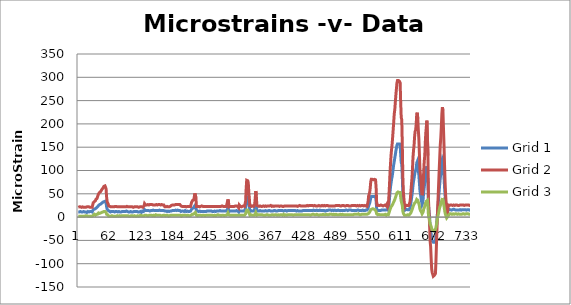
| Category | Grid 1 | Grid 2 | Grid 3 |
|---|---|---|---|
| 0 | 11 | 21 | 2 |
| 1 | 11 | 21 | 2 |
| 2 | 11 | 22 | 2 |
| 3 | 11 | 21 | 2 |
| 4 | 12 | 22 | 2 |
| 5 | 11 | 22 | 2 |
| 6 | 11 | 21 | 2 |
| 7 | 11 | 21 | 3 |
| 8 | 11 | 22 | 2 |
| 9 | 11 | 22 | 2 |
| 10 | 12 | 21 | 2 |
| 11 | 11 | 22 | 2 |
| 12 | 11 | 21 | 2 |
| 13 | 11 | 21 | 2 |
| 14 | 11 | 21 | 3 |
| 15 | 11 | 22 | 3 |
| 16 | 10 | 22 | 3 |
| 17 | 12 | 21 | 3 |
| 18 | 12 | 22 | 2 |
| 19 | 12 | 21 | 2 |
| 20 | 11 | 22 | 2 |
| 21 | 11 | 22 | 2 |
| 22 | 12 | 21 | 2 |
| 23 | 11 | 22 | 3 |
| 24 | 12 | 21 | 2 |
| 25 | 11 | 22 | 2 |
| 26 | 11 | 21 | 2 |
| 27 | 12 | 23 | 2 |
| 28 | 16 | 31 | 4 |
| 29 | 17 | 33 | 5 |
| 30 | 17 | 33 | 6 |
| 31 | 18 | 35 | 5 |
| 32 | 18 | 35 | 4 |
| 33 | 19 | 38 | 6 |
| 34 | 20 | 40 | 6 |
| 35 | 21 | 40 | 6 |
| 36 | 22 | 41 | 6 |
| 37 | 23 | 47 | 8 |
| 38 | 25 | 50 | 9 |
| 39 | 26 | 51 | 8 |
| 40 | 27 | 53 | 8 |
| 41 | 27 | 54 | 9 |
| 42 | 28 | 55 | 9 |
| 43 | 29 | 57 | 10 |
| 44 | 30 | 59 | 10 |
| 45 | 31 | 61 | 11 |
| 46 | 32 | 62 | 11 |
| 47 | 33 | 64 | 12 |
| 48 | 33 | 66 | 12 |
| 49 | 34 | 67 | 12 |
| 50 | 34 | 67 | 12 |
| 51 | 33 | 68 | 12 |
| 52 | 30 | 61 | 10 |
| 53 | 22 | 43 | 6 |
| 54 | 17 | 33 | 4 |
| 55 | 16 | 31 | 5 |
| 56 | 14 | 28 | 5 |
| 57 | 12 | 24 | 2 |
| 58 | 13 | 22 | 2 |
| 59 | 12 | 23 | 2 |
| 60 | 11 | 21 | 3 |
| 61 | 12 | 22 | 2 |
| 62 | 12 | 22 | 4 |
| 63 | 12 | 22 | 3 |
| 64 | 12 | 22 | 2 |
| 65 | 11 | 22 | 2 |
| 66 | 12 | 22 | 2 |
| 67 | 12 | 22 | 2 |
| 68 | 11 | 22 | 3 |
| 69 | 12 | 23 | 2 |
| 70 | 12 | 22 | 2 |
| 71 | 11 | 23 | 2 |
| 72 | 12 | 22 | 3 |
| 73 | 11 | 22 | 3 |
| 74 | 11 | 22 | 3 |
| 75 | 11 | 22 | 2 |
| 76 | 12 | 22 | 3 |
| 77 | 11 | 22 | 3 |
| 78 | 11 | 22 | 2 |
| 79 | 12 | 22 | 2 |
| 80 | 11 | 22 | 3 |
| 81 | 12 | 22 | 3 |
| 82 | 12 | 22 | 3 |
| 83 | 12 | 22 | 3 |
| 84 | 12 | 22 | 2 |
| 85 | 12 | 22 | 3 |
| 86 | 12 | 22 | 3 |
| 87 | 11 | 22 | 3 |
| 88 | 12 | 23 | 2 |
| 89 | 12 | 22 | 3 |
| 90 | 13 | 21 | 2 |
| 91 | 12 | 23 | 3 |
| 92 | 12 | 22 | 4 |
| 93 | 12 | 22 | 3 |
| 94 | 11 | 22 | 3 |
| 95 | 12 | 22 | 2 |
| 96 | 11 | 22 | 2 |
| 97 | 12 | 22 | 2 |
| 98 | 12 | 21 | 3 |
| 99 | 13 | 22 | 3 |
| 100 | 11 | 22 | 3 |
| 101 | 12 | 22 | 3 |
| 102 | 11 | 22 | 3 |
| 103 | 12 | 21 | 2 |
| 104 | 12 | 23 | 3 |
| 105 | 11 | 22 | 3 |
| 106 | 12 | 23 | 2 |
| 107 | 12 | 22 | 2 |
| 108 | 12 | 21 | 3 |
| 109 | 12 | 22 | 2 |
| 110 | 12 | 22 | 3 |
| 111 | 11 | 22 | 3 |
| 112 | 11 | 23 | 3 |
| 113 | 12 | 21 | 2 |
| 114 | 11 | 22 | 4 |
| 115 | 12 | 22 | 3 |
| 116 | 12 | 22 | 3 |
| 117 | 11 | 22 | 4 |
| 118 | 10 | 22 | 3 |
| 119 | 12 | 22 | 3 |
| 120 | 13 | 22 | 3 |
| 121 | 11 | 21 | 3 |
| 122 | 12 | 22 | 2 |
| 123 | 12 | 24 | 3 |
| 124 | 16 | 29 | 5 |
| 125 | 14 | 27 | 4 |
| 126 | 14 | 26 | 3 |
| 127 | 14 | 26 | 4 |
| 128 | 14 | 26 | 4 |
| 129 | 13 | 26 | 3 |
| 130 | 14 | 27 | 4 |
| 131 | 14 | 26 | 3 |
| 132 | 14 | 26 | 4 |
| 133 | 14 | 26 | 4 |
| 134 | 13 | 27 | 4 |
| 135 | 14 | 26 | 4 |
| 136 | 14 | 27 | 3 |
| 137 | 15 | 26 | 4 |
| 138 | 14 | 27 | 4 |
| 139 | 14 | 27 | 3 |
| 140 | 15 | 26 | 4 |
| 141 | 14 | 26 | 4 |
| 142 | 14 | 26 | 4 |
| 143 | 14 | 26 | 3 |
| 144 | 14 | 26 | 4 |
| 145 | 14 | 26 | 5 |
| 146 | 14 | 27 | 4 |
| 147 | 14 | 27 | 4 |
| 148 | 14 | 26 | 4 |
| 149 | 14 | 26 | 4 |
| 150 | 14 | 27 | 4 |
| 151 | 14 | 27 | 4 |
| 152 | 15 | 27 | 4 |
| 153 | 14 | 27 | 4 |
| 154 | 14 | 26 | 4 |
| 155 | 14 | 27 | 3 |
| 156 | 14 | 27 | 4 |
| 157 | 14 | 26 | 3 |
| 158 | 14 | 26 | 3 |
| 159 | 13 | 26 | 4 |
| 160 | 14 | 26 | 4 |
| 161 | 13 | 24 | 4 |
| 162 | 13 | 22 | 3 |
| 163 | 12 | 22 | 3 |
| 164 | 13 | 22 | 3 |
| 165 | 11 | 22 | 4 |
| 166 | 12 | 23 | 3 |
| 167 | 13 | 23 | 4 |
| 168 | 13 | 22 | 3 |
| 169 | 12 | 23 | 2 |
| 170 | 12 | 22 | 4 |
| 171 | 13 | 23 | 3 |
| 172 | 13 | 23 | 4 |
| 173 | 12 | 23 | 4 |
| 174 | 13 | 25 | 4 |
| 175 | 15 | 27 | 4 |
| 176 | 14 | 26 | 4 |
| 177 | 15 | 26 | 4 |
| 178 | 14 | 26 | 4 |
| 179 | 15 | 27 | 4 |
| 180 | 14 | 26 | 5 |
| 181 | 15 | 26 | 4 |
| 182 | 15 | 27 | 4 |
| 183 | 14 | 27 | 4 |
| 184 | 14 | 27 | 3 |
| 185 | 15 | 27 | 4 |
| 186 | 15 | 27 | 4 |
| 187 | 14 | 27 | 4 |
| 188 | 14 | 27 | 4 |
| 189 | 15 | 26 | 4 |
| 190 | 14 | 27 | 4 |
| 191 | 13 | 25 | 4 |
| 192 | 12 | 24 | 4 |
| 193 | 13 | 23 | 2 |
| 194 | 13 | 23 | 3 |
| 195 | 12 | 23 | 4 |
| 196 | 13 | 23 | 4 |
| 197 | 12 | 23 | 4 |
| 198 | 12 | 23 | 4 |
| 199 | 11 | 23 | 4 |
| 200 | 14 | 23 | 3 |
| 201 | 12 | 23 | 4 |
| 202 | 12 | 22 | 3 |
| 203 | 13 | 23 | 3 |
| 204 | 13 | 23 | 4 |
| 205 | 13 | 23 | 4 |
| 206 | 12 | 23 | 4 |
| 207 | 13 | 23 | 3 |
| 208 | 12 | 23 | 4 |
| 209 | 12 | 23 | 3 |
| 210 | 13 | 23 | 3 |
| 211 | 13 | 25 | 4 |
| 212 | 17 | 32 | 5 |
| 213 | 17 | 32 | 6 |
| 214 | 19 | 36 | 6 |
| 215 | 20 | 37 | 6 |
| 216 | 20 | 37 | 7 |
| 217 | 23 | 43 | 8 |
| 218 | 25 | 51 | 10 |
| 219 | 26 | 51 | 10 |
| 220 | 22 | 42 | 7 |
| 221 | 13 | 23 | 4 |
| 222 | 13 | 22 | 4 |
| 223 | 13 | 23 | 3 |
| 224 | 12 | 23 | 4 |
| 225 | 12 | 23 | 4 |
| 226 | 13 | 24 | 3 |
| 227 | 13 | 22 | 4 |
| 228 | 13 | 22 | 4 |
| 229 | 12 | 23 | 4 |
| 230 | 13 | 23 | 4 |
| 231 | 12 | 24 | 3 |
| 232 | 13 | 22 | 4 |
| 233 | 12 | 23 | 4 |
| 234 | 12 | 23 | 4 |
| 235 | 12 | 23 | 4 |
| 236 | 13 | 23 | 3 |
| 237 | 12 | 23 | 3 |
| 238 | 12 | 22 | 4 |
| 239 | 12 | 23 | 4 |
| 240 | 13 | 23 | 4 |
| 241 | 13 | 23 | 4 |
| 242 | 13 | 24 | 4 |
| 243 | 13 | 23 | 4 |
| 244 | 13 | 23 | 4 |
| 245 | 13 | 23 | 4 |
| 246 | 12 | 22 | 5 |
| 247 | 13 | 23 | 4 |
| 248 | 12 | 23 | 4 |
| 249 | 13 | 23 | 4 |
| 250 | 12 | 23 | 3 |
| 251 | 12 | 23 | 4 |
| 252 | 13 | 23 | 4 |
| 253 | 12 | 23 | 3 |
| 254 | 13 | 23 | 3 |
| 255 | 13 | 23 | 4 |
| 256 | 13 | 23 | 4 |
| 257 | 12 | 23 | 3 |
| 258 | 13 | 23 | 4 |
| 259 | 13 | 23 | 4 |
| 260 | 13 | 23 | 3 |
| 261 | 13 | 23 | 5 |
| 262 | 13 | 23 | 4 |
| 263 | 13 | 23 | 4 |
| 264 | 13 | 23 | 5 |
| 265 | 14 | 23 | 4 |
| 266 | 13 | 22 | 5 |
| 267 | 13 | 23 | 3 |
| 268 | 13 | 23 | 4 |
| 269 | 13 | 24 | 4 |
| 270 | 14 | 22 | 4 |
| 271 | 13 | 23 | 4 |
| 272 | 13 | 23 | 4 |
| 273 | 13 | 23 | 3 |
| 274 | 13 | 23 | 3 |
| 275 | 13 | 23 | 4 |
| 276 | 13 | 24 | 4 |
| 277 | 13 | 23 | 4 |
| 278 | 13 | 24 | 3 |
| 279 | 17 | 33 | 6 |
| 280 | 20 | 38 | 9 |
| 281 | 17 | 32 | 6 |
| 282 | 12 | 22 | 4 |
| 283 | 13 | 24 | 4 |
| 284 | 13 | 23 | 4 |
| 285 | 13 | 23 | 4 |
| 286 | 13 | 23 | 4 |
| 287 | 13 | 23 | 4 |
| 288 | 13 | 23 | 5 |
| 289 | 13 | 23 | 4 |
| 290 | 13 | 23 | 5 |
| 291 | 12 | 23 | 4 |
| 292 | 13 | 23 | 5 |
| 293 | 13 | 23 | 4 |
| 294 | 13 | 24 | 4 |
| 295 | 13 | 24 | 4 |
| 296 | 14 | 24 | 4 |
| 297 | 14 | 24 | 4 |
| 298 | 13 | 23 | 4 |
| 299 | 12 | 23 | 4 |
| 300 | 11 | 20 | 4 |
| 301 | 14 | 26 | 4 |
| 302 | 16 | 28 | 5 |
| 303 | 13 | 23 | 4 |
| 304 | 13 | 23 | 4 |
| 305 | 13 | 22 | 4 |
| 306 | 12 | 22 | 4 |
| 307 | 13 | 23 | 4 |
| 308 | 13 | 23 | 4 |
| 309 | 13 | 24 | 4 |
| 310 | 13 | 23 | 5 |
| 311 | 13 | 23 | 4 |
| 312 | 13 | 25 | 4 |
| 313 | 20 | 34 | 7 |
| 314 | 32 | 61 | 12 |
| 315 | 39 | 79 | 15 |
| 316 | 41 | 79 | 16 |
| 317 | 42 | 78 | 15 |
| 318 | 39 | 73 | 14 |
| 319 | 28 | 52 | 10 |
| 320 | 22 | 39 | 7 |
| 321 | 12 | 22 | 4 |
| 322 | 13 | 25 | 5 |
| 323 | 14 | 26 | 5 |
| 324 | 13 | 23 | 4 |
| 325 | 13 | 23 | 4 |
| 326 | 13 | 24 | 5 |
| 327 | 13 | 24 | 4 |
| 328 | 13 | 23 | 4 |
| 329 | 14 | 24 | 4 |
| 330 | 16 | 28 | 5 |
| 331 | 22 | 41 | 7 |
| 332 | 30 | 56 | 10 |
| 333 | 24 | 46 | 8 |
| 334 | 14 | 25 | 4 |
| 335 | 13 | 23 | 4 |
| 336 | 13 | 24 | 5 |
| 337 | 13 | 24 | 5 |
| 338 | 13 | 23 | 5 |
| 339 | 13 | 24 | 5 |
| 340 | 14 | 24 | 5 |
| 341 | 13 | 23 | 5 |
| 342 | 13 | 23 | 5 |
| 343 | 13 | 23 | 5 |
| 344 | 13 | 23 | 5 |
| 345 | 13 | 24 | 5 |
| 346 | 13 | 24 | 4 |
| 347 | 13 | 23 | 4 |
| 348 | 13 | 23 | 4 |
| 349 | 14 | 23 | 4 |
| 350 | 14 | 24 | 4 |
| 351 | 13 | 24 | 4 |
| 352 | 13 | 23 | 5 |
| 353 | 13 | 24 | 4 |
| 354 | 13 | 24 | 5 |
| 355 | 13 | 24 | 5 |
| 356 | 14 | 24 | 4 |
| 357 | 13 | 23 | 5 |
| 358 | 14 | 24 | 4 |
| 359 | 14 | 24 | 4 |
| 360 | 13 | 25 | 4 |
| 361 | 13 | 24 | 5 |
| 362 | 13 | 23 | 5 |
| 363 | 14 | 23 | 4 |
| 364 | 13 | 24 | 5 |
| 365 | 14 | 23 | 5 |
| 366 | 14 | 23 | 4 |
| 367 | 13 | 25 | 5 |
| 368 | 14 | 24 | 5 |
| 369 | 13 | 24 | 4 |
| 370 | 13 | 24 | 5 |
| 371 | 14 | 24 | 5 |
| 372 | 13 | 24 | 4 |
| 373 | 13 | 24 | 5 |
| 374 | 14 | 24 | 5 |
| 375 | 14 | 23 | 5 |
| 376 | 14 | 23 | 4 |
| 377 | 13 | 24 | 5 |
| 378 | 14 | 24 | 5 |
| 379 | 13 | 24 | 4 |
| 380 | 14 | 24 | 5 |
| 381 | 13 | 25 | 4 |
| 382 | 14 | 23 | 4 |
| 383 | 13 | 24 | 4 |
| 384 | 13 | 23 | 6 |
| 385 | 13 | 24 | 5 |
| 386 | 14 | 24 | 4 |
| 387 | 13 | 23 | 5 |
| 388 | 14 | 24 | 5 |
| 389 | 13 | 24 | 5 |
| 390 | 13 | 24 | 4 |
| 391 | 13 | 25 | 5 |
| 392 | 14 | 24 | 5 |
| 393 | 13 | 24 | 5 |
| 394 | 14 | 24 | 5 |
| 395 | 13 | 24 | 5 |
| 396 | 14 | 24 | 5 |
| 397 | 13 | 25 | 5 |
| 398 | 14 | 24 | 5 |
| 399 | 13 | 24 | 5 |
| 400 | 14 | 24 | 5 |
| 401 | 14 | 24 | 5 |
| 402 | 14 | 24 | 4 |
| 403 | 13 | 24 | 5 |
| 404 | 14 | 24 | 5 |
| 405 | 14 | 25 | 4 |
| 406 | 14 | 24 | 5 |
| 407 | 14 | 24 | 4 |
| 408 | 13 | 24 | 5 |
| 409 | 14 | 24 | 4 |
| 410 | 14 | 23 | 5 |
| 411 | 15 | 24 | 4 |
| 412 | 13 | 24 | 5 |
| 413 | 14 | 24 | 5 |
| 414 | 13 | 25 | 5 |
| 415 | 13 | 25 | 5 |
| 416 | 13 | 24 | 5 |
| 417 | 14 | 24 | 6 |
| 418 | 13 | 24 | 5 |
| 419 | 13 | 24 | 5 |
| 420 | 14 | 24 | 5 |
| 421 | 13 | 24 | 5 |
| 422 | 14 | 24 | 5 |
| 423 | 14 | 24 | 5 |
| 424 | 14 | 24 | 5 |
| 425 | 14 | 24 | 4 |
| 426 | 14 | 24 | 5 |
| 427 | 13 | 24 | 4 |
| 428 | 14 | 25 | 5 |
| 429 | 14 | 24 | 5 |
| 430 | 14 | 24 | 5 |
| 431 | 13 | 25 | 5 |
| 432 | 14 | 25 | 5 |
| 433 | 14 | 24 | 5 |
| 434 | 14 | 25 | 4 |
| 435 | 14 | 24 | 6 |
| 436 | 14 | 25 | 5 |
| 437 | 13 | 25 | 5 |
| 438 | 14 | 25 | 6 |
| 439 | 14 | 25 | 4 |
| 440 | 15 | 24 | 6 |
| 441 | 14 | 25 | 5 |
| 442 | 14 | 25 | 5 |
| 443 | 14 | 24 | 5 |
| 444 | 14 | 24 | 5 |
| 445 | 14 | 25 | 5 |
| 446 | 15 | 24 | 6 |
| 447 | 13 | 23 | 5 |
| 448 | 14 | 24 | 5 |
| 449 | 14 | 24 | 5 |
| 450 | 14 | 25 | 4 |
| 451 | 14 | 24 | 5 |
| 452 | 15 | 24 | 5 |
| 453 | 13 | 25 | 5 |
| 454 | 14 | 24 | 5 |
| 455 | 13 | 24 | 5 |
| 456 | 14 | 25 | 5 |
| 457 | 14 | 25 | 5 |
| 458 | 14 | 24 | 6 |
| 459 | 14 | 25 | 5 |
| 460 | 14 | 25 | 5 |
| 461 | 14 | 25 | 6 |
| 462 | 13 | 24 | 5 |
| 463 | 14 | 24 | 5 |
| 464 | 14 | 25 | 6 |
| 465 | 13 | 24 | 5 |
| 466 | 14 | 25 | 5 |
| 467 | 14 | 25 | 5 |
| 468 | 15 | 24 | 5 |
| 469 | 14 | 24 | 6 |
| 470 | 15 | 24 | 6 |
| 471 | 14 | 24 | 5 |
| 472 | 15 | 24 | 6 |
| 473 | 14 | 24 | 5 |
| 474 | 14 | 24 | 6 |
| 475 | 15 | 24 | 5 |
| 476 | 15 | 24 | 5 |
| 477 | 14 | 25 | 5 |
| 478 | 14 | 24 | 6 |
| 479 | 14 | 25 | 5 |
| 480 | 15 | 24 | 5 |
| 481 | 13 | 25 | 5 |
| 482 | 14 | 25 | 6 |
| 483 | 15 | 25 | 5 |
| 484 | 14 | 25 | 5 |
| 485 | 14 | 24 | 5 |
| 486 | 15 | 25 | 5 |
| 487 | 14 | 24 | 6 |
| 488 | 14 | 25 | 5 |
| 489 | 15 | 25 | 5 |
| 490 | 14 | 24 | 6 |
| 491 | 14 | 25 | 5 |
| 492 | 14 | 24 | 5 |
| 493 | 14 | 24 | 6 |
| 494 | 14 | 25 | 6 |
| 495 | 14 | 25 | 5 |
| 496 | 14 | 25 | 5 |
| 497 | 15 | 24 | 5 |
| 498 | 14 | 24 | 5 |
| 499 | 15 | 25 | 5 |
| 500 | 15 | 24 | 5 |
| 501 | 15 | 24 | 5 |
| 502 | 15 | 25 | 5 |
| 503 | 14 | 25 | 5 |
| 504 | 14 | 25 | 5 |
| 505 | 14 | 25 | 5 |
| 506 | 15 | 24 | 5 |
| 507 | 14 | 24 | 6 |
| 508 | 15 | 24 | 5 |
| 509 | 14 | 25 | 6 |
| 510 | 15 | 24 | 5 |
| 511 | 14 | 24 | 5 |
| 512 | 14 | 25 | 5 |
| 513 | 14 | 25 | 5 |
| 514 | 14 | 25 | 5 |
| 515 | 15 | 25 | 6 |
| 516 | 14 | 25 | 6 |
| 517 | 14 | 25 | 5 |
| 518 | 14 | 25 | 6 |
| 519 | 15 | 25 | 6 |
| 520 | 14 | 24 | 6 |
| 521 | 14 | 24 | 5 |
| 522 | 15 | 25 | 6 |
| 523 | 15 | 24 | 6 |
| 524 | 15 | 24 | 7 |
| 525 | 14 | 25 | 5 |
| 526 | 14 | 25 | 5 |
| 527 | 14 | 25 | 6 |
| 528 | 14 | 24 | 5 |
| 529 | 14 | 25 | 5 |
| 530 | 14 | 25 | 6 |
| 531 | 15 | 25 | 6 |
| 532 | 15 | 25 | 6 |
| 533 | 15 | 24 | 6 |
| 534 | 14 | 24 | 6 |
| 535 | 15 | 25 | 5 |
| 536 | 14 | 25 | 6 |
| 537 | 14 | 25 | 6 |
| 538 | 15 | 24 | 6 |
| 539 | 15 | 25 | 5 |
| 540 | 15 | 23 | 6 |
| 541 | 15 | 24 | 5 |
| 542 | 19 | 33 | 7 |
| 543 | 24 | 45 | 9 |
| 544 | 25 | 44 | 9 |
| 545 | 30 | 53 | 11 |
| 546 | 35 | 62 | 13 |
| 547 | 41 | 76 | 16 |
| 548 | 44 | 81 | 16 |
| 549 | 44 | 81 | 17 |
| 550 | 44 | 81 | 16 |
| 551 | 42 | 81 | 18 |
| 552 | 44 | 80 | 17 |
| 553 | 44 | 80 | 17 |
| 554 | 44 | 81 | 16 |
| 555 | 44 | 81 | 16 |
| 556 | 44 | 80 | 16 |
| 557 | 35 | 64 | 12 |
| 558 | 20 | 33 | 7 |
| 559 | 14 | 23 | 6 |
| 560 | 15 | 26 | 5 |
| 561 | 14 | 25 | 6 |
| 562 | 15 | 25 | 6 |
| 563 | 14 | 25 | 6 |
| 564 | 15 | 25 | 5 |
| 565 | 14 | 24 | 6 |
| 566 | 14 | 26 | 5 |
| 567 | 15 | 24 | 6 |
| 568 | 15 | 25 | 5 |
| 569 | 15 | 26 | 6 |
| 570 | 15 | 24 | 5 |
| 571 | 15 | 25 | 4 |
| 572 | 15 | 25 | 5 |
| 573 | 15 | 25 | 4 |
| 574 | 16 | 26 | 6 |
| 575 | 15 | 25 | 4 |
| 576 | 15 | 24 | 4 |
| 577 | 16 | 26 | 5 |
| 578 | 18 | 29 | 6 |
| 579 | 15 | 24 | 5 |
| 580 | 17 | 27 | 5 |
| 581 | 27 | 46 | 7 |
| 582 | 39 | 68 | 12 |
| 583 | 53 | 94 | 16 |
| 584 | 65 | 115 | 19 |
| 585 | 73 | 133 | 22 |
| 586 | 81 | 146 | 23 |
| 587 | 87 | 157 | 25 |
| 588 | 95 | 172 | 27 |
| 589 | 104 | 188 | 30 |
| 590 | 113 | 205 | 32 |
| 591 | 120 | 222 | 35 |
| 592 | 127 | 231 | 37 |
| 593 | 134 | 247 | 41 |
| 594 | 142 | 262 | 45 |
| 595 | 148 | 275 | 48 |
| 596 | 154 | 288 | 52 |
| 597 | 157 | 293 | 53 |
| 598 | 158 | 292 | 54 |
| 599 | 157 | 293 | 53 |
| 600 | 157 | 291 | 53 |
| 601 | 157 | 291 | 53 |
| 602 | 154 | 288 | 53 |
| 603 | 135 | 247 | 42 |
| 604 | 117 | 214 | 34 |
| 605 | 114 | 209 | 34 |
| 606 | 88 | 157 | 25 |
| 607 | 50 | 87 | 13 |
| 608 | 32 | 54 | 8 |
| 609 | 25 | 40 | 6 |
| 610 | 18 | 27 | 4 |
| 611 | 15 | 23 | 4 |
| 612 | 16 | 26 | 4 |
| 613 | 17 | 25 | 4 |
| 614 | 16 | 25 | 4 |
| 615 | 16 | 24 | 4 |
| 616 | 17 | 25 | 5 |
| 617 | 16 | 24 | 4 |
| 618 | 16 | 25 | 4 |
| 619 | 16 | 24 | 5 |
| 620 | 19 | 31 | 6 |
| 621 | 22 | 38 | 6 |
| 622 | 30 | 53 | 9 |
| 623 | 38 | 68 | 12 |
| 624 | 46 | 82 | 14 |
| 625 | 55 | 102 | 18 |
| 626 | 68 | 128 | 22 |
| 627 | 77 | 143 | 25 |
| 628 | 83 | 154 | 27 |
| 629 | 91 | 172 | 30 |
| 630 | 97 | 184 | 32 |
| 631 | 100 | 187 | 32 |
| 632 | 105 | 199 | 34 |
| 633 | 116 | 221 | 38 |
| 634 | 119 | 224 | 40 |
| 635 | 112 | 211 | 36 |
| 636 | 100 | 187 | 32 |
| 637 | 90 | 168 | 29 |
| 638 | 74 | 136 | 24 |
| 639 | 57 | 103 | 17 |
| 640 | 49 | 89 | 14 |
| 641 | 42 | 75 | 12 |
| 642 | 34 | 57 | 10 |
| 643 | 27 | 47 | 7 |
| 644 | 30 | 51 | 8 |
| 645 | 39 | 69 | 11 |
| 646 | 53 | 96 | 17 |
| 647 | 64 | 119 | 20 |
| 648 | 72 | 131 | 23 |
| 649 | 85 | 160 | 29 |
| 650 | 97 | 181 | 31 |
| 651 | 103 | 194 | 34 |
| 652 | 109 | 207 | 36 |
| 653 | 110 | 206 | 36 |
| 654 | 73 | 132 | 22 |
| 655 | 25 | 36 | 3 |
| 656 | 11 | 9 | -1 |
| 657 | 1 | -13 | -6 |
| 658 | -19 | -51 | -14 |
| 659 | -24 | -63 | -16 |
| 660 | -36 | -89 | -20 |
| 661 | -48 | -112 | -25 |
| 662 | -51 | -119 | -27 |
| 663 | -53 | -123 | -28 |
| 664 | -54 | -127 | -29 |
| 665 | -55 | -128 | -30 |
| 666 | -54 | -125 | -29 |
| 667 | -54 | -124 | -29 |
| 668 | -51 | -121 | -28 |
| 669 | -38 | -93 | -22 |
| 670 | -20 | -55 | -15 |
| 671 | -19 | -53 | -14 |
| 672 | 13 | 13 | -1 |
| 673 | 27 | 42 | 4 |
| 674 | 42 | 71 | 9 |
| 675 | 56 | 100 | 15 |
| 676 | 71 | 127 | 21 |
| 677 | 83 | 154 | 24 |
| 678 | 92 | 170 | 27 |
| 679 | 103 | 193 | 32 |
| 680 | 119 | 221 | 37 |
| 681 | 125 | 236 | 41 |
| 682 | 122 | 229 | 39 |
| 683 | 103 | 191 | 30 |
| 684 | 86 | 155 | 24 |
| 685 | 65 | 113 | 16 |
| 686 | 47 | 76 | 9 |
| 687 | 34 | 49 | 5 |
| 688 | 24 | 30 | 1 |
| 689 | 14 | 12 | -2 |
| 690 | 6 | -2 | -4 |
| 691 | 14 | 17 | 1 |
| 692 | 18 | 26 | 3 |
| 693 | 16 | 26 | 5 |
| 694 | 16 | 25 | 6 |
| 695 | 16 | 26 | 7 |
| 696 | 16 | 26 | 7 |
| 697 | 15 | 26 | 7 |
| 698 | 15 | 26 | 6 |
| 699 | 15 | 26 | 6 |
| 700 | 16 | 25 | 7 |
| 701 | 16 | 26 | 7 |
| 702 | 17 | 26 | 6 |
| 703 | 15 | 27 | 6 |
| 704 | 16 | 25 | 6 |
| 705 | 16 | 26 | 7 |
| 706 | 15 | 26 | 6 |
| 707 | 16 | 26 | 7 |
| 708 | 15 | 26 | 7 |
| 709 | 16 | 25 | 6 |
| 710 | 15 | 25 | 6 |
| 711 | 15 | 27 | 7 |
| 712 | 15 | 25 | 6 |
| 713 | 16 | 26 | 6 |
| 714 | 16 | 26 | 6 |
| 715 | 16 | 26 | 6 |
| 716 | 15 | 26 | 7 |
| 717 | 15 | 26 | 6 |
| 718 | 16 | 26 | 7 |
| 719 | 15 | 26 | 7 |
| 720 | 16 | 26 | 7 |
| 721 | 16 | 26 | 7 |
| 722 | 16 | 25 | 6 |
| 723 | 15 | 26 | 6 |
| 724 | 16 | 26 | 7 |
| 725 | 16 | 26 | 7 |
| 726 | 15 | 26 | 7 |
| 727 | 15 | 26 | 7 |
| 728 | 16 | 26 | 6 |
| 729 | 16 | 26 | 7 |
| 730 | 16 | 26 | 8 |
| 731 | 16 | 26 | 6 |
| 732 | 15 | 25 | 7 |
| 733 | 16 | 25 | 7 |
| 734 | 16 | 26 | 7 |